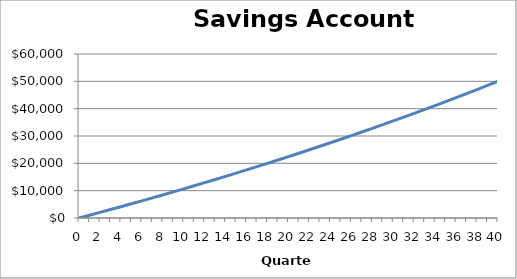
| Category | Series 0 |
|---|---|
| 0.0 | 0 |
| 1.0 | 1017.52 |
| 2.0 | 2045.47 |
| 3.0 | 3083.96 |
| 4.0 | 4133.09 |
| 5.0 | 5192.97 |
| 6.0 | 6263.72 |
| 7.0 | 7345.44 |
| 8.0 | 8438.25 |
| 9.0 | 9542.26 |
| 10.0 | 10657.59 |
| 11.0 | 11784.35 |
| 12.0 | 12922.66 |
| 13.0 | 14072.64 |
| 14.0 | 15234.4 |
| 15.0 | 16408.07 |
| 16.0 | 17593.77 |
| 17.0 | 18791.63 |
| 18.0 | 20001.76 |
| 19.0 | 21224.3 |
| 20.0 | 22459.37 |
| 21.0 | 23707.1 |
| 22.0 | 24967.62 |
| 23.0 | 26241.06 |
| 24.0 | 27527.55 |
| 25.0 | 28827.23 |
| 26.0 | 30140.23 |
| 27.0 | 31466.69 |
| 28.0 | 32806.74 |
| 29.0 | 34160.53 |
| 30.0 | 35528.2 |
| 31.0 | 36909.88 |
| 32.0 | 38305.73 |
| 33.0 | 39715.88 |
| 34.0 | 41140.49 |
| 35.0 | 42579.7 |
| 36.0 | 44033.66 |
| 37.0 | 45502.53 |
| 38.0 | 46986.45 |
| 39.0 | 48485.58 |
| 40.0 | 50000.08 |